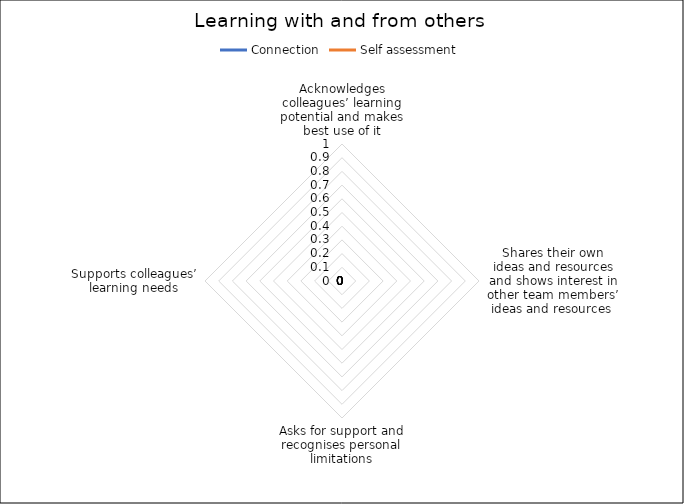
| Category | Connection | Self assessment |
|---|---|---|
| Acknowledges colleagues’ learning potential and makes best use of it | 0 | 0 |
| Shares their own ideas and resources and shows interest in other team members’ ideas and resources  | 0 | 0 |
| Asks for support and recognises personal limitations | 0 | 0 |
| Supports colleagues’ learning needs | 0 | 0 |